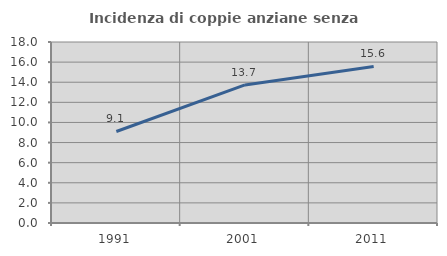
| Category | Incidenza di coppie anziane senza figli  |
|---|---|
| 1991.0 | 9.101 |
| 2001.0 | 13.73 |
| 2011.0 | 15.57 |